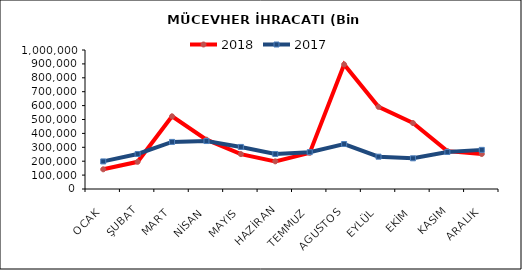
| Category | 2018 | 2017 |
|---|---|---|
| OCAK | 141692.588 | 198486.618 |
| ŞUBAT | 195479.577 | 251788.183 |
| MART | 522694.851 | 338911.838 |
| NİSAN | 354849.103 | 345064.098 |
| MAYIS | 251183.096 | 302669.663 |
| HAZİRAN | 198940.98 | 252020.965 |
| TEMMUZ | 260011.257 | 265027.534 |
| AGUSTOS | 896156.594 | 323546.412 |
| EYLÜL | 590873.949 | 232554.262 |
| EKİM | 474413.229 | 220880.335 |
| KASIM | 272280.957 | 266195.852 |
| ARALIK | 251863.103 | 281485.859 |